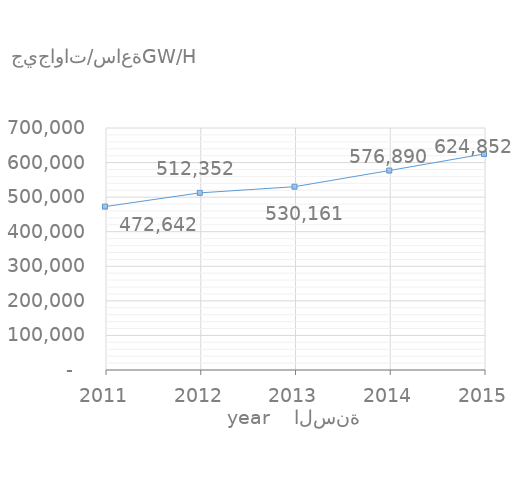
| Category | القيمة
Value |
|---|---|
| 2015.0 | 624852 |
| 2014.0 | 576890 |
| 2013.0 | 530161 |
| 2012.0 | 512352 |
| 2011.0 | 472642 |